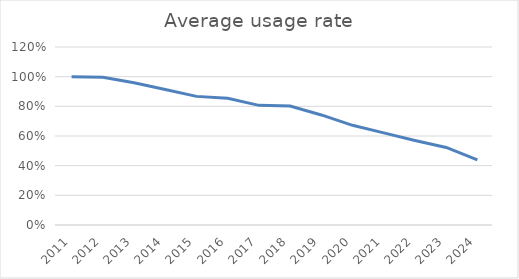
| Category | Average usage rate |
|---|---|
| 2011.0 | 1 |
| 2012.0 | 0.995 |
| 2013.0 | 0.959 |
| 2014.0 | 0.914 |
| 2015.0 | 0.867 |
| 2016.0 | 0.854 |
| 2017.0 | 0.807 |
| 2018.0 | 0.802 |
| 2019.0 | 0.742 |
| 2020.0 | 0.672 |
| 2021.0 | 0.621 |
| 2022.0 | 0.57 |
| 2023.0 | 0.523 |
| 2024.0 | 0.44 |